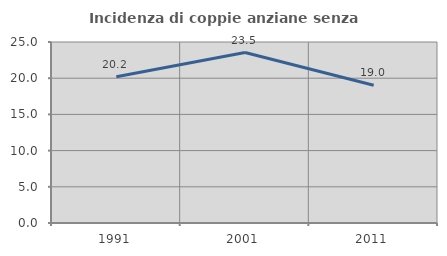
| Category | Incidenza di coppie anziane senza figli  |
|---|---|
| 1991.0 | 20.189 |
| 2001.0 | 23.548 |
| 2011.0 | 19.03 |